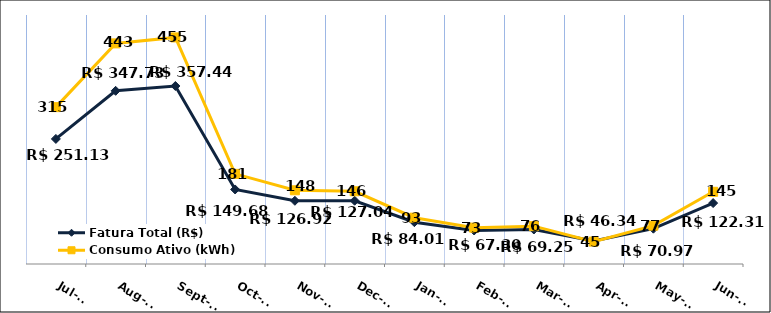
| Category | Fatura Total (R$) |
|---|---|
| 2023-07-01 | 251.13 |
| 2023-08-01 | 347.73 |
| 2023-09-01 | 357.44 |
| 2023-10-01 | 149.68 |
| 2023-11-01 | 126.92 |
| 2023-12-01 | 127.04 |
| 2024-01-01 | 84.01 |
| 2024-02-01 | 67.3 |
| 2024-03-01 | 69.25 |
| 2024-04-01 | 46.34 |
| 2024-05-01 | 70.97 |
| 2024-06-01 | 122.31 |